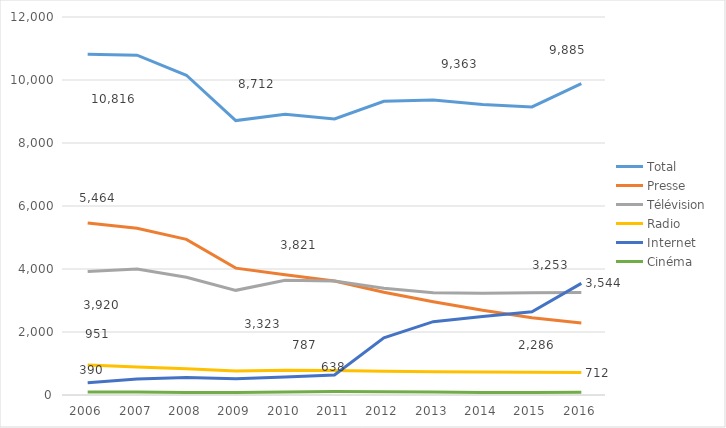
| Category | Total | Presse | Télévision | Radio | Internet | Cinéma |
|---|---|---|---|---|---|---|
| 2006.0 | 10816.479 | 5463.752 | 3919.502 | 950.998 | 390.268 | 91.96 |
| 2007.0 | 10787.085 | 5294.092 | 3996.813 | 889.531 | 508.304 | 98.346 |
| 2008.0 | 10150.198 | 4941.826 | 3735.926 | 837.252 | 554.585 | 80.608 |
| 2009.0 | 8712.191 | 4026.959 | 3322.51 | 762.438 | 517.598 | 82.687 |
| 2010.0 | 8913.704 | 3820.612 | 3639.736 | 786.97 | 571.188 | 95.198 |
| 2011.0 | 8762.513 | 3619.366 | 3621.438 | 774.839 | 638.102 | 108.767 |
| 2012.0 | 9324.055 | 3260.422 | 3390.473 | 750.842 | 1815.635 | 106.683 |
| 2013.0 | 9363.295 | 2960.276 | 3242.303 | 741.328 | 2327.73 | 91.659 |
| 2014.0 | 9220.248 | 2688.905 | 3229.091 | 727.598 | 2493.476 | 81.178 |
| 2015.0 | 9146.434 | 2454.41 | 3247.836 | 721.296 | 2640.745 | 82.148 |
| 2016.0 | 9885 | 2286 | 3253 | 712 | 3544 | 90 |